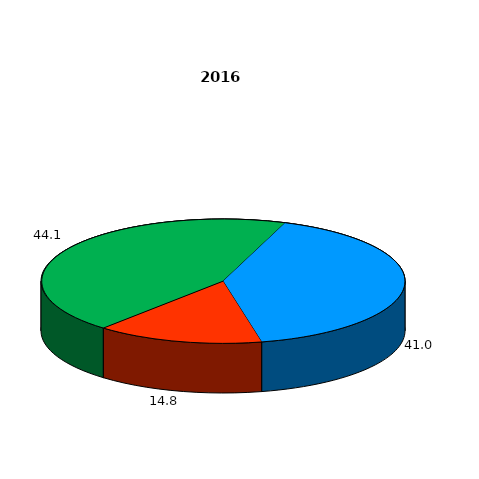
| Category | Series 0 |
|---|---|
| Сельскохозяйственные организации  | 41 |
| Крестьянские (фермерские) хозяйства и индивидуальные предприниматели  | 14.8 |
| Личные подсобные и другие индивидуальные хозяйства граждан  | 44.1 |